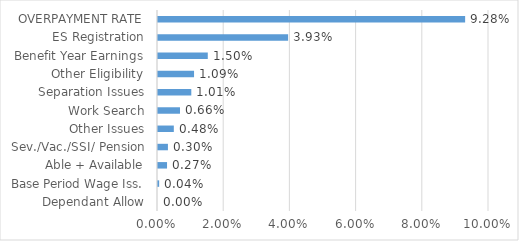
| Category | Series 0 |
|---|---|
| Dependant Allow | 0 |
| Base Period Wage Iss. | 0 |
| Able + Available | 0.003 |
| Sev./Vac./SSI/ Pension | 0.003 |
| Other Issues | 0.005 |
| Work Search | 0.007 |
| Separation Issues | 0.01 |
| Other Eligibility | 0.011 |
| Benefit Year Earnings | 0.015 |
| ES Registration | 0.039 |
| OVERPAYMENT RATE | 0.093 |